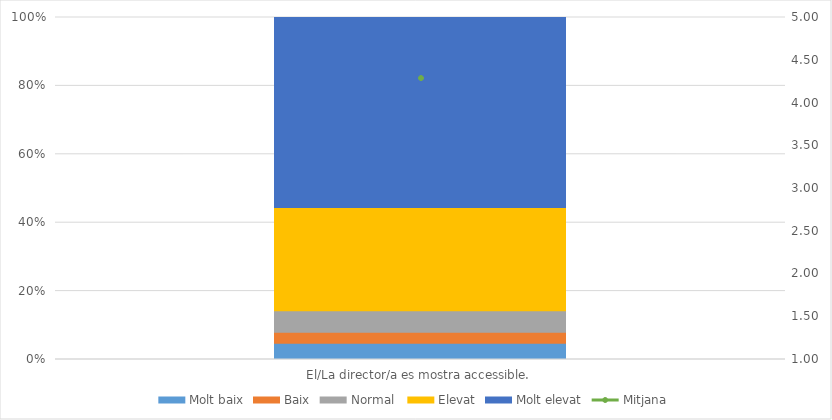
| Category | Molt baix | Baix | Normal  | Elevat | Molt elevat |
|---|---|---|---|---|---|
| El/La director/a es mostra accessible. | 3 | 2 | 4 | 19 | 35 |